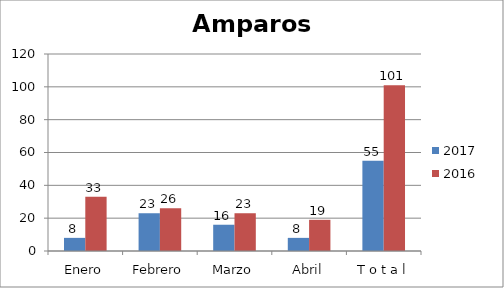
| Category | 2017 | 2016 |
|---|---|---|
| Enero | 8 | 33 |
| Febrero | 23 | 26 |
| Marzo | 16 | 23 |
| Abril | 8 | 19 |
| T o t a l | 55 | 101 |